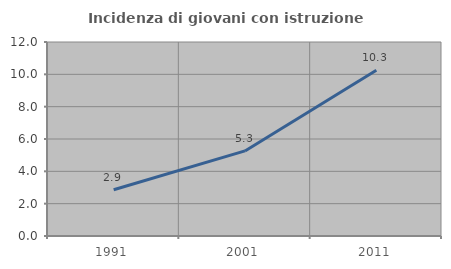
| Category | Incidenza di giovani con istruzione universitaria |
|---|---|
| 1991.0 | 2.857 |
| 2001.0 | 5.263 |
| 2011.0 | 10.256 |